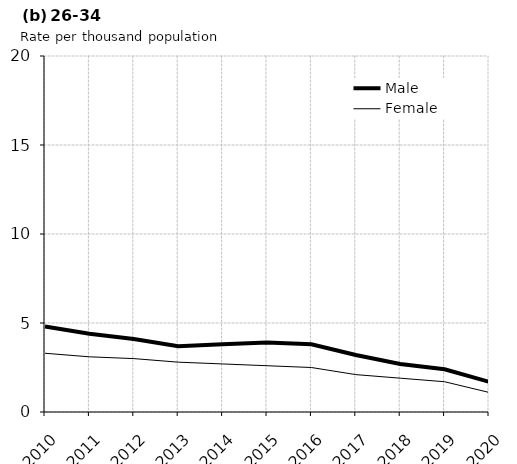
| Category | Male | Female |
|---|---|---|
| 2010.0 | 4.8 | 3.3 |
| 2011.0 | 4.4 | 3.1 |
| 2012.0 | 4.1 | 3 |
| 2013.0 | 3.7 | 2.8 |
| 2014.0 | 3.8 | 2.7 |
| 2015.0 | 3.9 | 2.6 |
| 2016.0 | 3.8 | 2.5 |
| 2017.0 | 3.2 | 2.1 |
| 2018.0 | 2.7 | 1.9 |
| 2019.0 | 2.4 | 1.7 |
| 2020.0 | 1.7 | 1.1 |